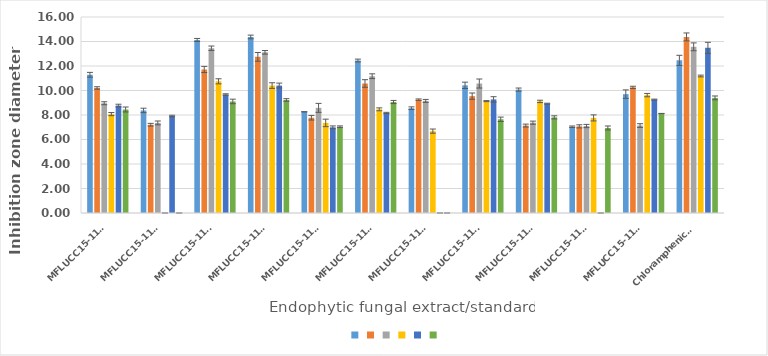
| Category | Series 0 | Series 1 | Series 2 | Series 3 | Series 4 | Series 5 |
|---|---|---|---|---|---|---|
| MFLUCC15-1112 | 11.283 | 10.207 | 8.96 | 8.073 | 8.77 | 8.45 |
| MFLUCC15-1113 | 8.373 | 7.207 | 7.353 | 0 | 7.917 | 0 |
| MFLUCC15-1130 | 14.123 | 11.717 | 13.45 | 10.75 | 9.673 | 9.107 |
| MFLUCC15-1131 | 14.37 | 12.747 | 13.117 | 10.403 | 10.403 | 9.227 |
| MFLUCC15-1132 | 8.26 | 7.777 | 8.583 | 7.353 | 6.993 | 7.04 |
| MFLUCC15-1133 | 12.447 | 10.573 | 11.167 | 8.463 | 8.167 | 9.06 |
| MFLUCC15-1134 | 8.553 | 9.25 | 9.15 | 6.683 | 0 | 0 |
| MFLUCC15-1135 | 10.42 | 9.54 | 10.57 | 9.133 | 9.273 | 7.65 |
| MFLUCC15-1136 | 10.073 | 7.137 | 7.373 | 9.11 | 8.923 | 7.807 |
| MFLUCC15-1137 | 7.04 | 7.073 | 7.1 | 7.763 | 0 | 6.94 |
| MFLUCC15-1138 | 9.703 | 10.257 | 7.14 | 9.623 | 9.257 | 8.12 |
| Chloramphenicol  | 12.46 | 14.373 | 13.567 | 11.183 | 13.483 | 9.397 |